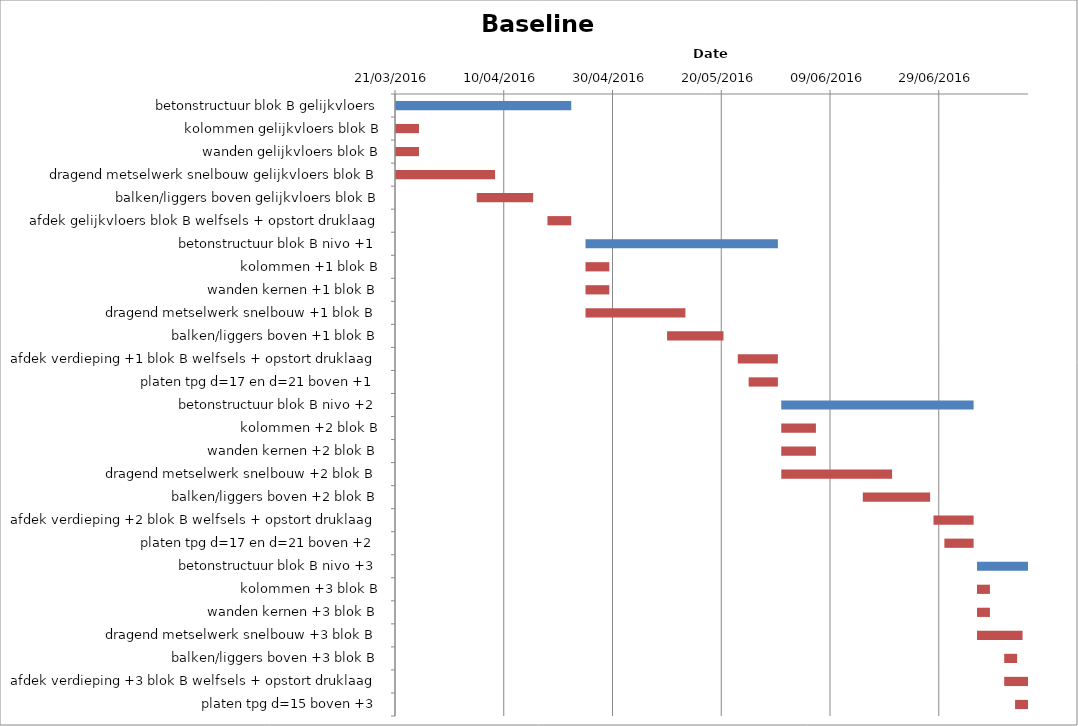
| Category | Baseline start | Actual duration |
|---|---|---|
| betonstructuur blok B gelijkvloers | 42450.333 | 32.375 |
| kolommen gelijkvloers blok B | 42450.333 | 4.375 |
| wanden gelijkvloers blok B | 42450.333 | 4.375 |
| dragend metselwerk snelbouw gelijkvloers blok B | 42450.333 | 18.375 |
| balken/liggers boven gelijkvloers blok B | 42465.333 | 10.375 |
| afdek gelijkvloers blok B welfsels + opstort druklaag | 42478.333 | 4.375 |
| betonstructuur blok B nivo +1 | 42485.333 | 35.375 |
| kolommen +1 blok B | 42485.333 | 4.375 |
| wanden kernen +1 blok B | 42485.333 | 4.375 |
| dragend metselwerk snelbouw +1 blok B | 42485.333 | 18.375 |
| balken/liggers boven +1 blok B | 42500.333 | 10.375 |
| afdek verdieping +1 blok B welfsels + opstort druklaag | 42513.333 | 7.375 |
| platen tpg d=17 en d=21 boven +1 | 42515.333 | 5.375 |
| betonstructuur blok B nivo +2 | 42521.333 | 35.375 |
| kolommen +2 blok B | 42521.333 | 6.375 |
| wanden kernen +2 blok B | 42521.333 | 6.375 |
| dragend metselwerk snelbouw +2 blok B | 42521.333 | 20.375 |
| balken/liggers boven +2 blok B | 42536.333 | 12.375 |
| afdek verdieping +2 blok B welfsels + opstort druklaag | 42549.333 | 7.375 |
| platen tpg d=17 en d=21 boven +2 | 42551.333 | 5.375 |
| betonstructuur blok B nivo +3 | 42557.333 | 9.375 |
| kolommen +3 blok B | 42557.333 | 2.375 |
| wanden kernen +3 blok B | 42557.333 | 2.375 |
| dragend metselwerk snelbouw +3 blok B | 42557.333 | 8.375 |
| balken/liggers boven +3 blok B | 42562.333 | 2.375 |
| afdek verdieping +3 blok B welfsels + opstort druklaag | 42562.333 | 4.375 |
| platen tpg d=15 boven +3 | 42564.333 | 2.375 |